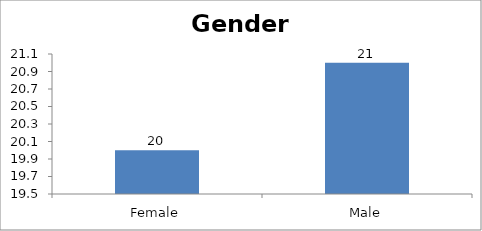
| Category | Gender |
|---|---|
| Female | 20 |
| Male | 21 |